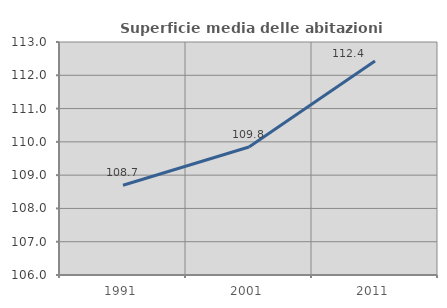
| Category | Superficie media delle abitazioni occupate |
|---|---|
| 1991.0 | 108.698 |
| 2001.0 | 109.847 |
| 2011.0 | 112.426 |